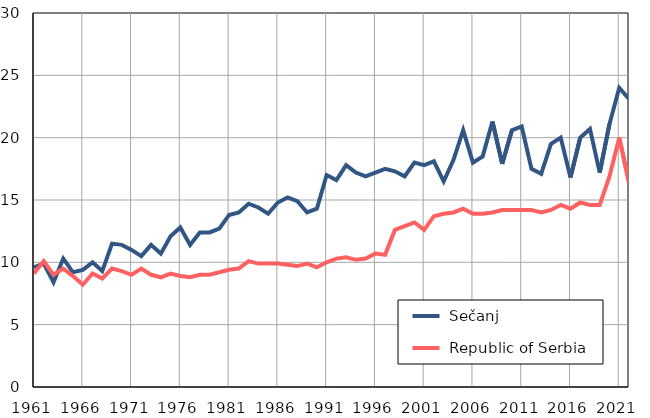
| Category |  Sečanj |  Republic of Serbia |
|---|---|---|
| 1961.0 | 9.6 | 9.1 |
| 1962.0 | 9.9 | 10.1 |
| 1963.0 | 8.4 | 9 |
| 1964.0 | 10.3 | 9.5 |
| 1965.0 | 9.2 | 8.9 |
| 1966.0 | 9.4 | 8.2 |
| 1967.0 | 10 | 9.1 |
| 1968.0 | 9.3 | 8.7 |
| 1969.0 | 11.5 | 9.5 |
| 1970.0 | 11.4 | 9.3 |
| 1971.0 | 11 | 9 |
| 1972.0 | 10.5 | 9.5 |
| 1973.0 | 11.4 | 9 |
| 1974.0 | 10.7 | 8.8 |
| 1975.0 | 12.1 | 9.1 |
| 1976.0 | 12.8 | 8.9 |
| 1977.0 | 11.4 | 8.8 |
| 1978.0 | 12.4 | 9 |
| 1979.0 | 12.4 | 9 |
| 1980.0 | 12.7 | 9.2 |
| 1981.0 | 13.8 | 9.4 |
| 1982.0 | 14 | 9.5 |
| 1983.0 | 14.7 | 10.1 |
| 1984.0 | 14.4 | 9.9 |
| 1985.0 | 13.9 | 9.9 |
| 1986.0 | 14.8 | 9.9 |
| 1987.0 | 15.2 | 9.8 |
| 1988.0 | 14.9 | 9.7 |
| 1989.0 | 14 | 9.9 |
| 1990.0 | 14.3 | 9.6 |
| 1991.0 | 17 | 10 |
| 1992.0 | 16.6 | 10.3 |
| 1993.0 | 17.8 | 10.4 |
| 1994.0 | 17.2 | 10.2 |
| 1995.0 | 16.9 | 10.3 |
| 1996.0 | 17.2 | 10.7 |
| 1997.0 | 17.5 | 10.6 |
| 1998.0 | 17.3 | 12.6 |
| 1999.0 | 16.9 | 12.9 |
| 2000.0 | 18 | 13.2 |
| 2001.0 | 17.8 | 12.6 |
| 2002.0 | 18.1 | 13.7 |
| 2003.0 | 16.5 | 13.9 |
| 2004.0 | 18.2 | 14 |
| 2005.0 | 20.6 | 14.3 |
| 2006.0 | 18 | 13.9 |
| 2007.0 | 18.5 | 13.9 |
| 2008.0 | 21.3 | 14 |
| 2009.0 | 17.9 | 14.2 |
| 2010.0 | 20.6 | 14.2 |
| 2011.0 | 20.9 | 14.2 |
| 2012.0 | 17.5 | 14.2 |
| 2013.0 | 17.1 | 14 |
| 2014.0 | 19.5 | 14.2 |
| 2015.0 | 20 | 14.6 |
| 2016.0 | 16.8 | 14.3 |
| 2017.0 | 20 | 14.8 |
| 2018.0 | 20.7 | 14.6 |
| 2019.0 | 17.2 | 14.6 |
| 2020.0 | 21.1 | 16.9 |
| 2021.0 | 24 | 20 |
| 2022.0 | 23.1 | 16.4 |